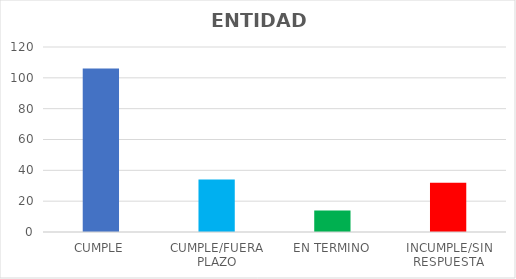
| Category | TOTAL |
|---|---|
| CUMPLE | 106 |
| CUMPLE/FUERA PLAZO | 34 |
| EN TERMINO | 14 |
| INCUMPLE/SIN RESPUESTA | 32 |